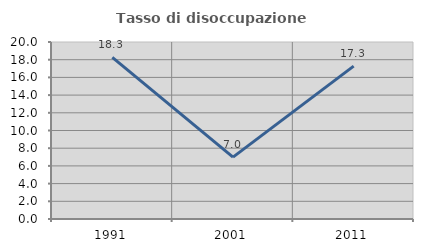
| Category | Tasso di disoccupazione giovanile  |
|---|---|
| 1991.0 | 18.257 |
| 2001.0 | 6.989 |
| 2011.0 | 17.273 |